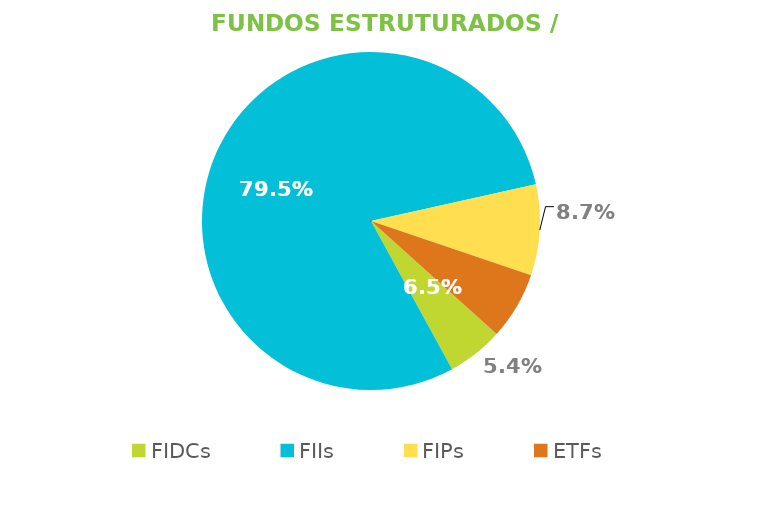
| Category | Fundos Estruturados / ETFs |
|---|---|
| FIDCs | 0.054 |
| FIIs | 0.795 |
| FIPs | 0.087 |
| ETFs | 0.065 |